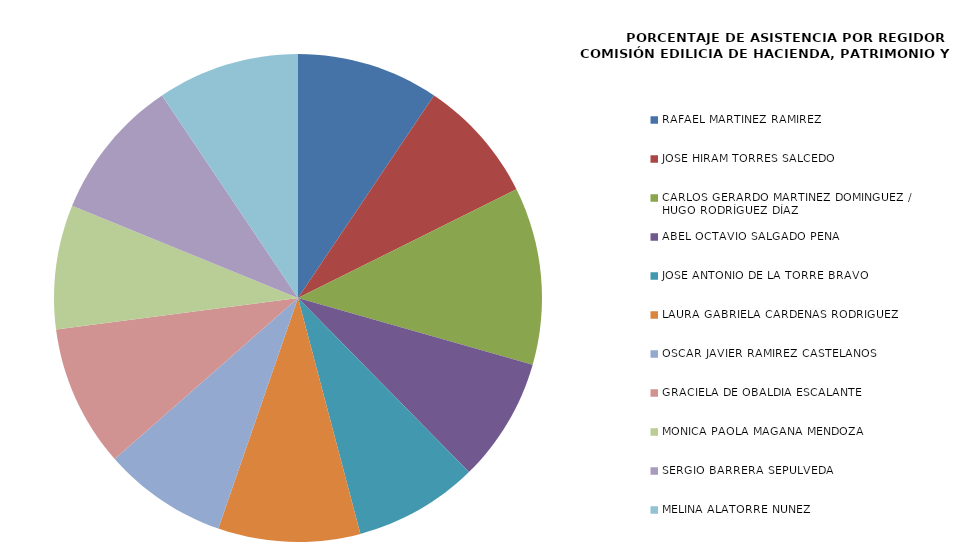
| Category | Series 0 |
|---|---|
| RAFAEL MARTÍNEZ RAMÍREZ | 100 |
| JOSÉ HIRAM TORRES SALCEDO | 87.5 |
| CARLOS GERARDO MARTÍNEZ DOMÍNGUEZ / 
HUGO RODRÍGUEZ DÍAZ | 125 |
| ABEL OCTAVIO SALGADO PEÑA  | 87.5 |
| JOSÉ ANTONIO DE LA TORRE BRAVO | 87.5 |
| LAURA GABRIELA CÁRDENAS RODRIGUEZ | 100 |
| OSCAR JAVIER RAMÍREZ CASTELANOS | 87.5 |
| GRACIELA DE OBALDÍA ESCALANTE | 100 |
| MÓNICA PAOLA MAGAÑA MENDOZA | 87.5 |
| SERGIO BARRERA SEPÚLVEDA | 100 |
| MELINA ALATORRE NÚÑEZ | 100 |